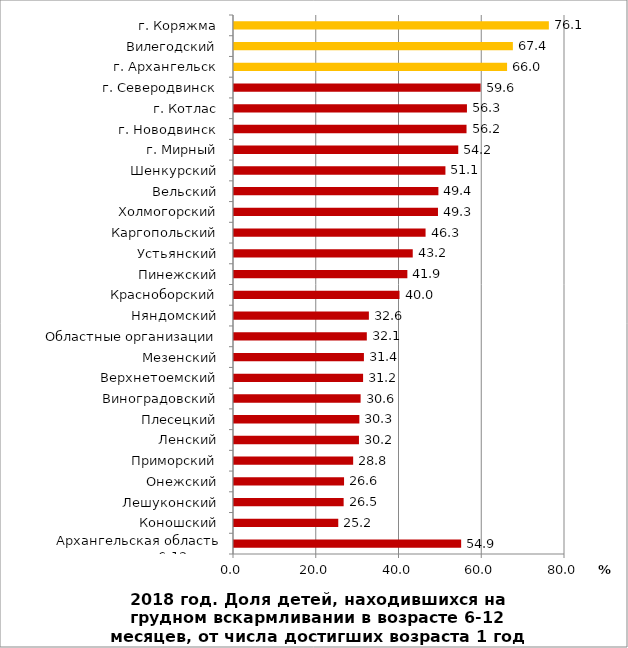
| Category | Series 0 |
|---|---|
| Архангельская область 6-12 мес. | 54.9 |
| Коношский | 25.2 |
| Лешуконский | 26.5 |
| Онежский | 26.6 |
| Приморский | 28.8 |
| Ленский | 30.2 |
| Плесецкий | 30.3 |
| Виноградовский | 30.6 |
| Верхнетоемский | 31.2 |
| Мезенский | 31.4 |
| Областные организации | 32.1 |
| Няндомский | 32.6 |
| Красноборский | 40 |
| Пинежский | 41.9 |
| Устьянский | 43.2 |
| Каргопольский | 46.3 |
| Холмогорский | 49.3 |
| Вельский | 49.4 |
| Шенкурский | 51.1 |
| г. Мирный | 54.2 |
| г. Новодвинск | 56.2 |
| г. Котлас | 56.3 |
| г. Северодвинск | 59.6 |
| г. Архангельск | 66 |
| Вилегодский | 67.4 |
| г. Коряжма | 76.1 |